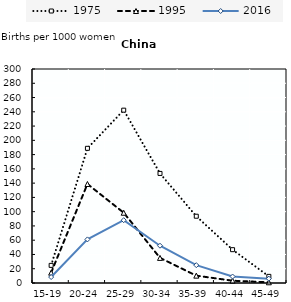
| Category | 1975 | 1995 | 2016 |
|---|---|---|---|
| 15-19 | 24.7 | 14.5 | 8.33 |
| 20-24 | 188.8 | 138.8 | 61.11 |
| 25-29 | 242.3 | 98.5 | 88.05 |
| 30-34 | 153.6 | 35.2 | 52.27 |
| 35-39 | 93.6 | 10.3 | 25.01 |
| 40-44 | 46.7 | 3.2 | 9.07 |
| 45-49 | 9.3 | 1 | 6.09 |